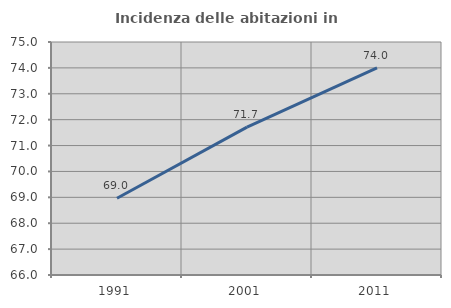
| Category | Incidenza delle abitazioni in proprietà  |
|---|---|
| 1991.0 | 68.963 |
| 2001.0 | 71.713 |
| 2011.0 | 74.004 |